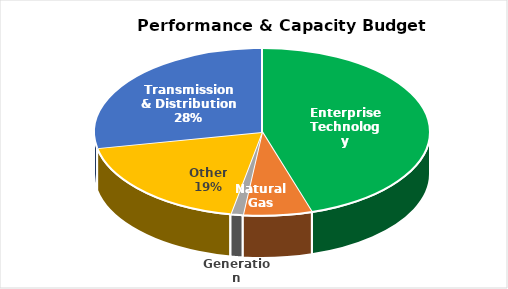
| Category | Series 0 |
|---|---|
| Enterprise Technology | 182621615 |
| Natural Gas | 26710000 |
| Generation | 4790000 |
| Other | 76335166 |
| Transmission & Distribution | 113512500 |